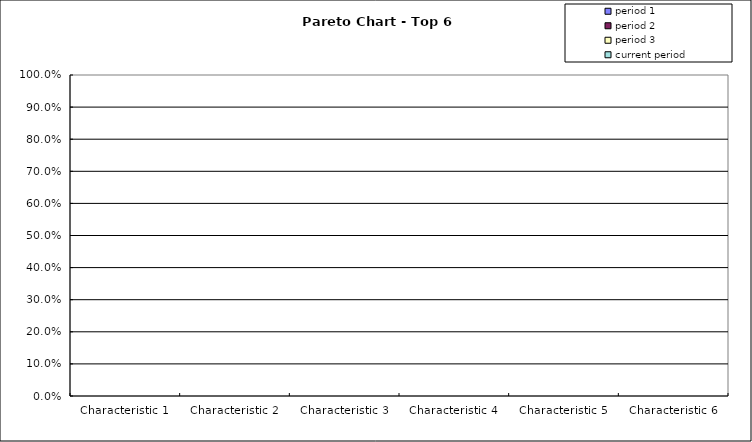
| Category | period 1 | period 2 | period 3 | current period |
|---|---|---|---|---|
| Characteristic 1 | 0 | 0 | 0 | 0 |
| Characteristic 2 | 0 | 0 | 0 | 0 |
| Characteristic 3 | 0 | 0 | 0 | 0 |
| Characteristic 4 | 0 | 0 | 0 | 0 |
| Characteristic 5 | 0 | 0 | 0 | 0 |
| Characteristic 6 | 0 | 0 | 0 | 0 |